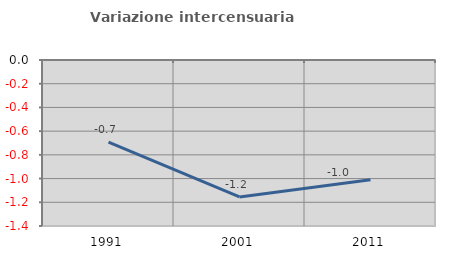
| Category | Variazione intercensuaria annua |
|---|---|
| 1991.0 | -0.693 |
| 2001.0 | -1.155 |
| 2011.0 | -1.01 |